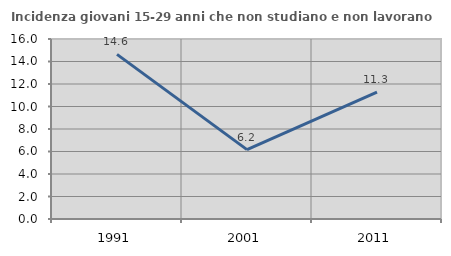
| Category | Incidenza giovani 15-29 anni che non studiano e non lavorano  |
|---|---|
| 1991.0 | 14.634 |
| 2001.0 | 6.17 |
| 2011.0 | 11.278 |